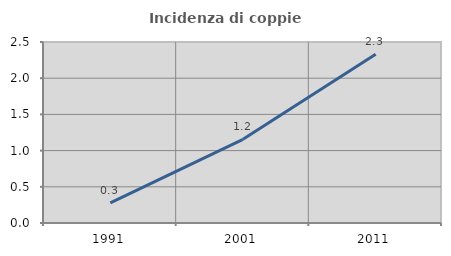
| Category | Incidenza di coppie miste |
|---|---|
| 1991.0 | 0.277 |
| 2001.0 | 1.156 |
| 2011.0 | 2.33 |